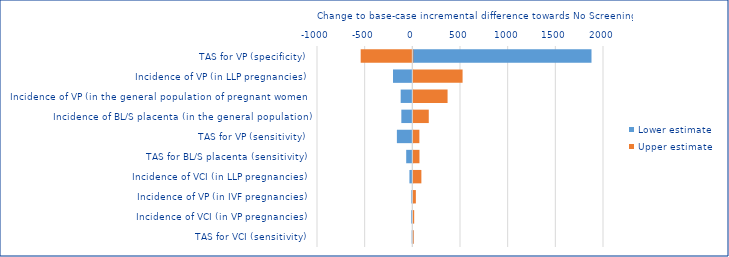
| Category | Lower estimate | Upper estimate |
|---|---|---|
| TAS for VP (specificity) | 1868.825 | -541.758 |
| Incidence of VP (in LLP pregnancies) | -202.706 | 516.564 |
| Incidence of VP (in the general population of pregnant women) | -122.214 | 359.131 |
| Incidence of BL/S placenta (in the general population) | -115.419 | 161.965 |
| TAS for VP (sensitivity) | -162.053 | 63.354 |
| TAS for BL/S placenta (sensitivity) | -64.327 | 64.327 |
| Incidence of VCI (in LLP pregnancies) | -30.405 | 84.342 |
| Incidence of VP (in IVF pregnancies) | -10.377 | 26.526 |
| Incidence of VCI (in VP pregnancies) | -11.818 | 8.865 |
| TAS for VCI (sensitivity) | -6.737 | 3.298 |